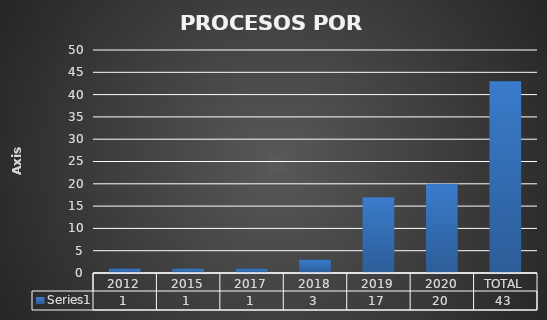
| Category | Series 0 |
|---|---|
| 2012 | 1 |
| 2015 | 1 |
| 2017 | 1 |
| 2018 | 3 |
| 2019 | 17 |
| 2020 | 20 |
| TOTAL | 43 |